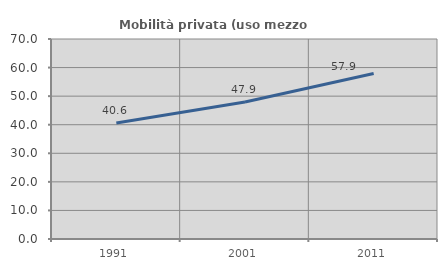
| Category | Mobilità privata (uso mezzo privato) |
|---|---|
| 1991.0 | 40.598 |
| 2001.0 | 47.936 |
| 2011.0 | 57.909 |